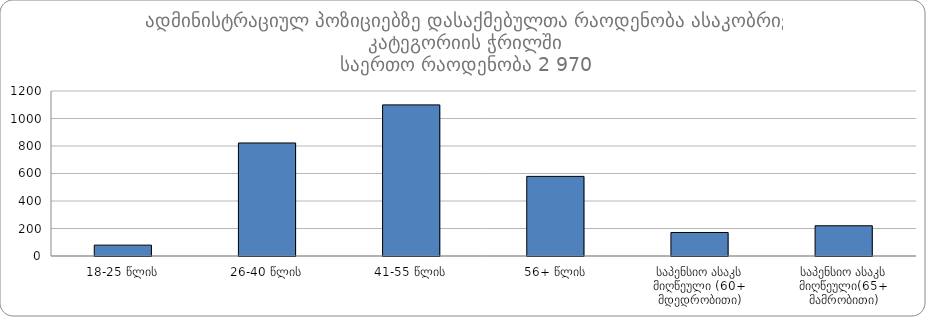
| Category | ჯამი |
|---|---|
| 18-25 წლის | 79 |
| 26-40 წლის | 822 |
| 41-55 წლის | 1099 |
| 56+ წლის | 579 |
| საპენსიო ასაკს მიღწეული (60+ მდედრობითი) | 171 |
| საპენსიო ასაკს მიღწეული(65+ მამრობითი) | 220 |